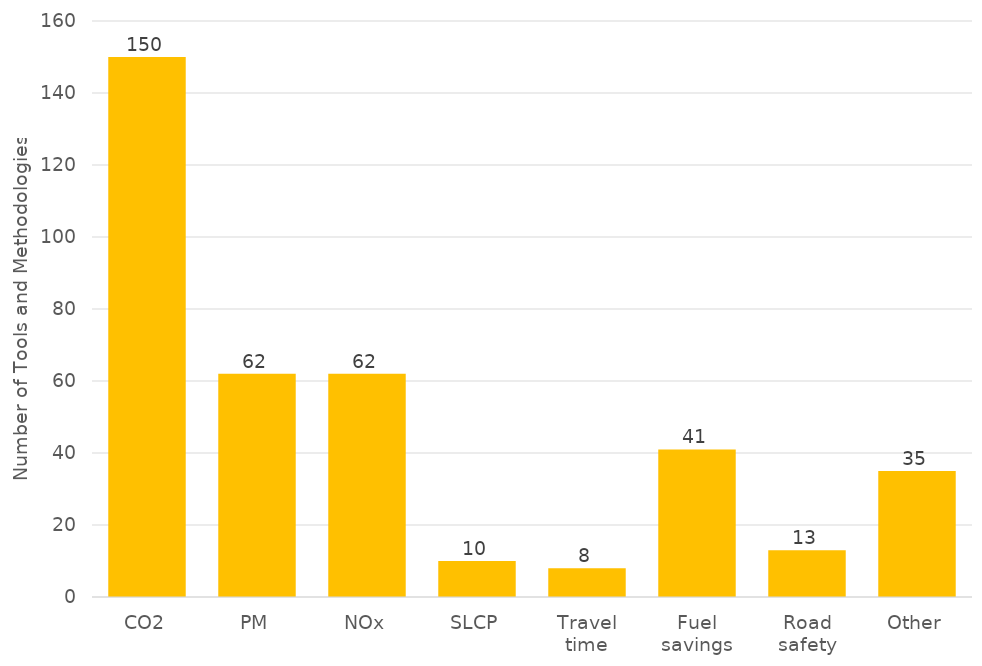
| Category | Series 0 |
|---|---|
| Intra-urban mass rapid transit investments | 0.135 |
| Comprehensive urban transport programes | 0.142 |
| Vehicle efficiency improvement programmes | 0.154 |
| Alternative fuels incentives | 0.2 |
| Inter-urban rail infrastructure | 0.081 |
| Freight transport infrastructure investments to shift mode | 0.081 |
| National fuel economy standards | 0.096 |
| Pricing policies  | 0.112 |